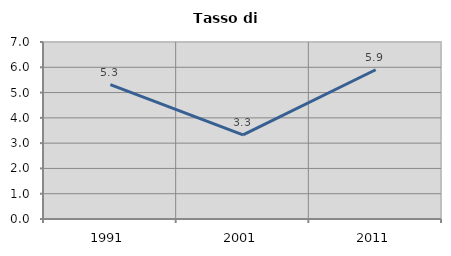
| Category | Tasso di disoccupazione   |
|---|---|
| 1991.0 | 5.318 |
| 2001.0 | 3.33 |
| 2011.0 | 5.903 |